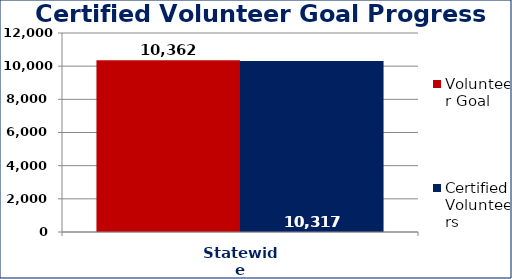
| Category | Volunteer Goal  | Certified Volunteers  |
|---|---|---|
| Statewide | 10362 | 10317 |